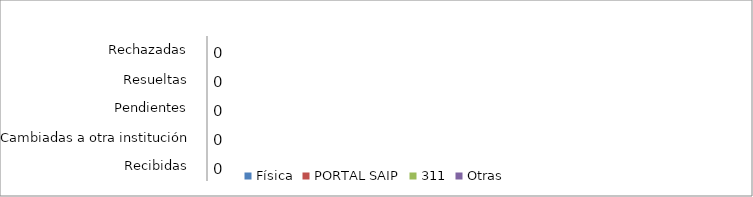
| Category | Física | PORTAL SAIP | 311 | Otras |
|---|---|---|---|---|
| Recibidas  | 0 | 0 | 0 | 0 |
| Cambiadas a otra institución | 0 | 0 | 0 | 0 |
| Pendientes  | 0 | 0 | 0 | 0 |
| Resueltas  | 0 | 0 | 0 | 0 |
| Rechazadas  | 0 | 0 | 0 | 0 |